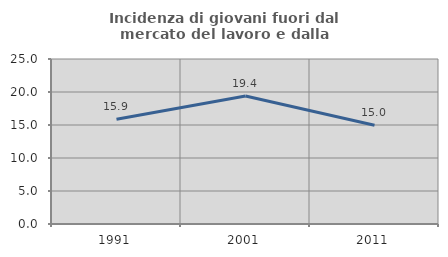
| Category | Incidenza di giovani fuori dal mercato del lavoro e dalla formazione  |
|---|---|
| 1991.0 | 15.863 |
| 2001.0 | 19.385 |
| 2011.0 | 14.968 |